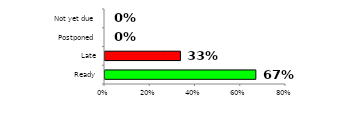
| Category | Series 0 |
|---|---|
| Ready | 0.667 |
| Late | 0.333 |
| Postponed | 0 |
| Not yet due | 0 |